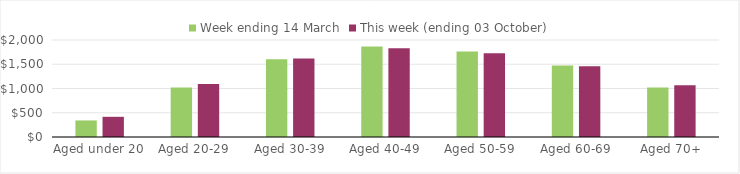
| Category | Week ending 14 March | This week (ending 03 October) |
|---|---|---|
| Aged under 20 | 341.29 | 416.3 |
| Aged 20-29 | 1019.22 | 1092.21 |
| Aged 30-39 | 1603.98 | 1620.55 |
| Aged 40-49 | 1864.11 | 1828.92 |
| Aged 50-59 | 1764.77 | 1724.82 |
| Aged 60-69 | 1472.81 | 1460.54 |
| Aged 70+ | 1023.08 | 1066.12 |